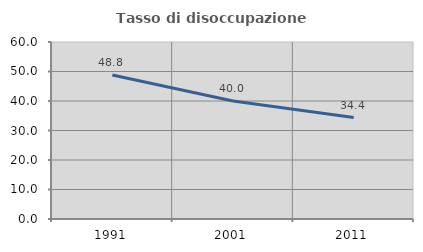
| Category | Tasso di disoccupazione giovanile  |
|---|---|
| 1991.0 | 48.8 |
| 2001.0 | 40 |
| 2011.0 | 34.4 |